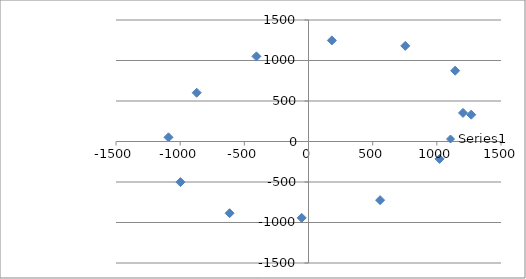
| Category | Series 0 |
|---|---|
| 1204.0 | 353 |
| 1021.0 | -215 |
| 558.0 | -724 |
| -53.0 | -943 |
| -615.0 | -885 |
| -998.0 | -501 |
| -1091.0 | 52 |
| -871.0 | 602 |
| -406.0 | 1051 |
| 182.0 | 1248 |
| 754.0 | 1180 |
| 1143.0 | 874 |
| 1268.0 | 331 |